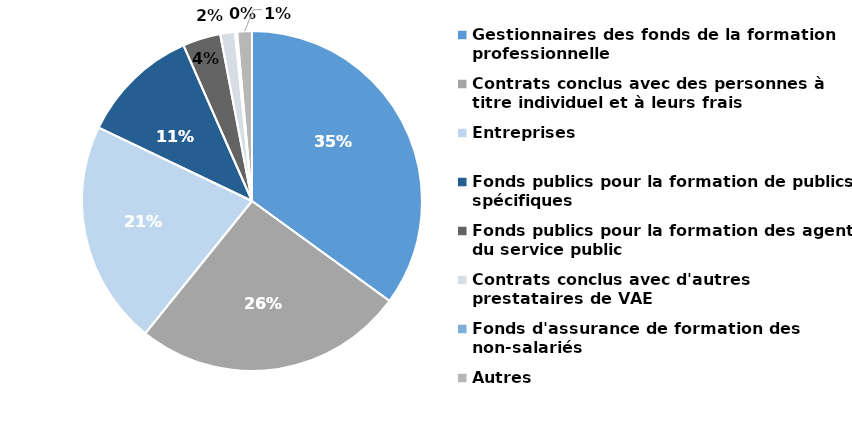
| Category | Répartition des financements |
|---|---|
| Gestionnaires des fonds de la formation professionnelle | 35 |
| Contrats conclus avec des personnes à titre individuel et à leurs frais | 25.8 |
| Entreprises | 21.3 |
| Fonds publics pour la formation de publics spécifiques | 11.3 |
| Fonds publics pour la formation des agents du service public | 3.6 |
| Contrats conclus avec d'autres prestataires de VAE | 1.4 |
| Fonds d'assurance de formation des non-salariés | 0.2 |
| Autres  | 1.4 |